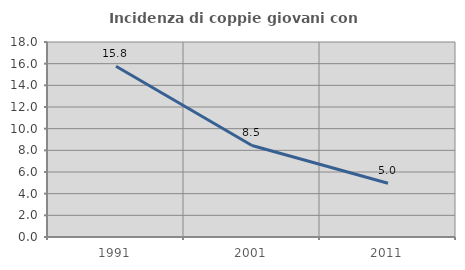
| Category | Incidenza di coppie giovani con figli |
|---|---|
| 1991.0 | 15.764 |
| 2001.0 | 8.451 |
| 2011.0 | 4.959 |